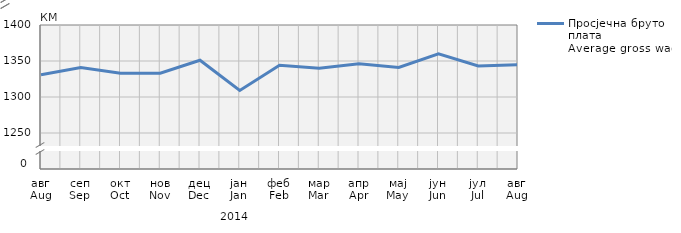
| Category | Просјечна бруто плата
Average gross wage |
|---|---|
| авг
Aug | 1331 |
| сеп
Sep | 1341 |
| окт
Oct | 1333 |
| нов
Nov | 1333 |
| дец
Dec | 1351 |
| јан
Jan | 1309 |
| феб
Feb | 1344 |
| мар
Mar | 1340 |
| апр
Apr | 1346 |
| мај
May | 1341 |
| јун
Jun | 1360 |
| јул
Jul | 1343 |
| авг
Aug | 1345 |